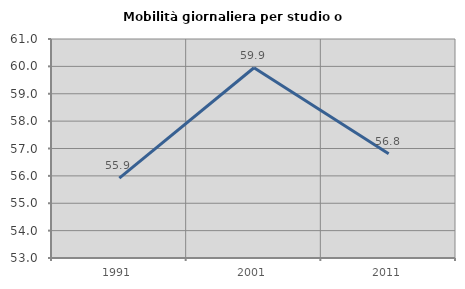
| Category | Mobilità giornaliera per studio o lavoro |
|---|---|
| 1991.0 | 55.921 |
| 2001.0 | 59.949 |
| 2011.0 | 56.812 |